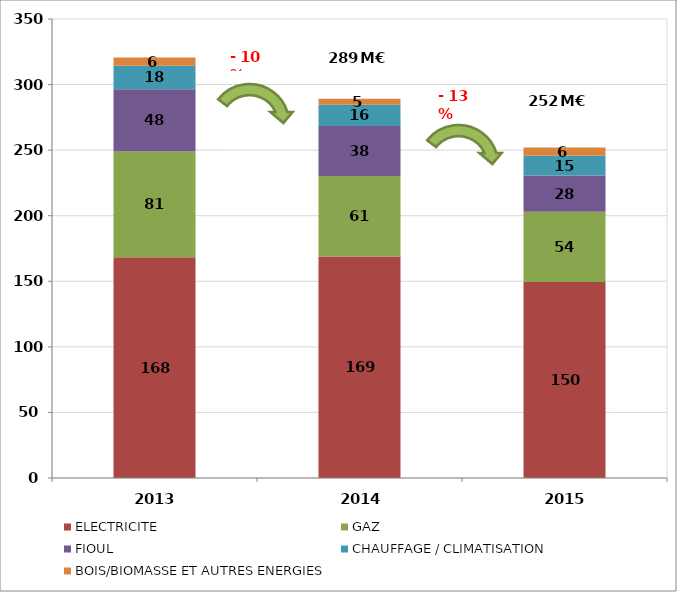
| Category | ELECTRICITE  | GAZ  | FIOUL  | CHAUFFAGE / CLIMATISATION  | BOIS/BIOMASSE ET AUTRES ENERGIES |
|---|---|---|---|---|---|
| 2013.0 | 168.238 | 80.643 | 47.589 | 17.909 | 6.343 |
| 2014.0 | 168.845 | 61.43 | 38.212 | 16.066 | 4.728 |
| 2015.0 | 149.515 | 53.535 | 27.63 | 15.029 | 6.281 |